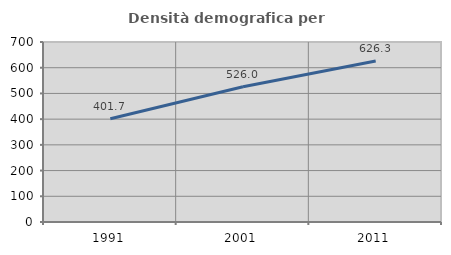
| Category | Densità demografica |
|---|---|
| 1991.0 | 401.693 |
| 2001.0 | 525.953 |
| 2011.0 | 626.28 |